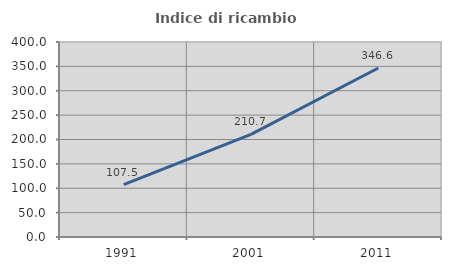
| Category | Indice di ricambio occupazionale  |
|---|---|
| 1991.0 | 107.514 |
| 2001.0 | 210.667 |
| 2011.0 | 346.602 |